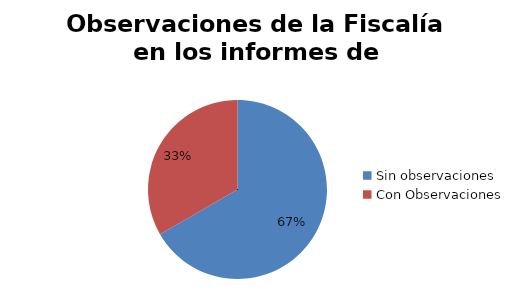
| Category | Series 0 |
|---|---|
| Sin observaciones | 32 |
| Con Observaciones | 16 |